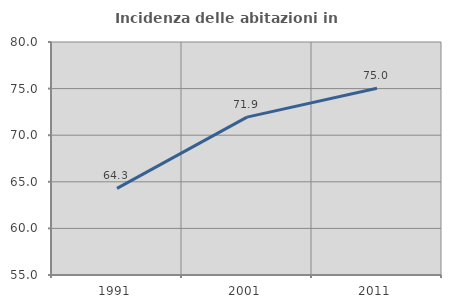
| Category | Incidenza delle abitazioni in proprietà  |
|---|---|
| 1991.0 | 64.301 |
| 2001.0 | 71.939 |
| 2011.0 | 75.039 |